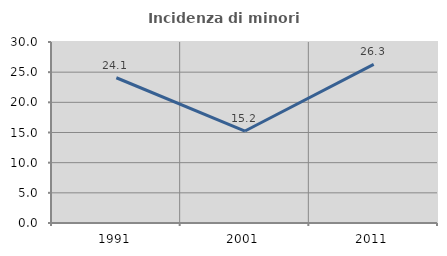
| Category | Incidenza di minori stranieri |
|---|---|
| 1991.0 | 24.074 |
| 2001.0 | 15.247 |
| 2011.0 | 26.296 |